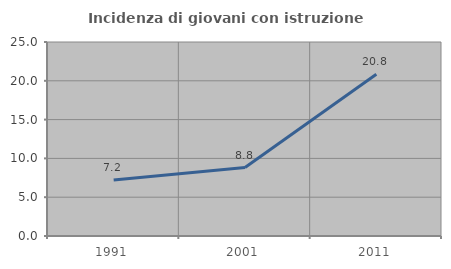
| Category | Incidenza di giovani con istruzione universitaria |
|---|---|
| 1991.0 | 7.229 |
| 2001.0 | 8.824 |
| 2011.0 | 20.833 |